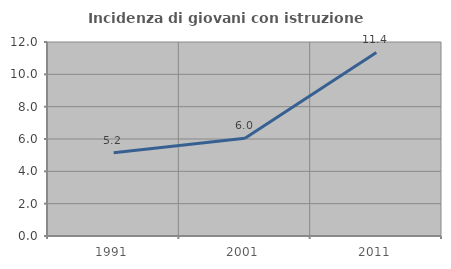
| Category | Incidenza di giovani con istruzione universitaria |
|---|---|
| 1991.0 | 5.155 |
| 2001.0 | 6.047 |
| 2011.0 | 11.354 |